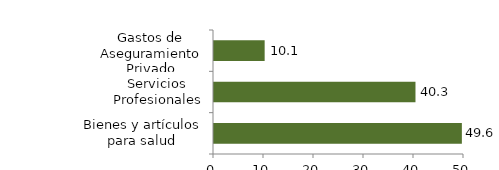
| Category | Salud |
|---|---|
| Bienes y artículos para salud | 49.573 |
| Servicios Profesionales | 40.296 |
| Gastos de Aseguramiento Privado | 10.132 |